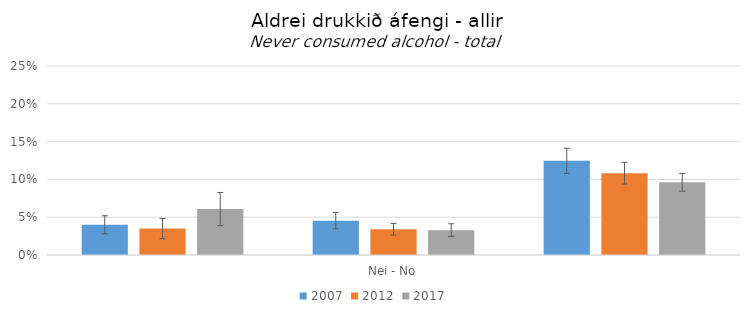
| Category | 2007 | 2012 | 2017 |
|---|---|---|---|
| 0 | 0.04 | 0.035 | 0.061 |
| 1 | 0.045 | 0.034 | 0.033 |
| 2 | 0.125 | 0.108 | 0.096 |